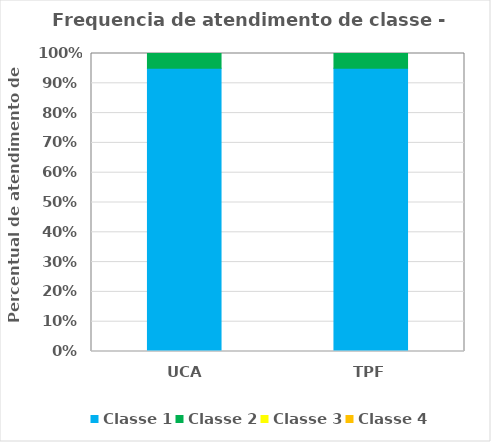
| Category | Classe 1 | Classe 2 | Classe 3 | Classe 4 |
|---|---|---|---|---|
| UCA | 0.951 | 0.049 | 0 | 0 |
| TPF | 0.951 | 0.049 | 0 | 0 |